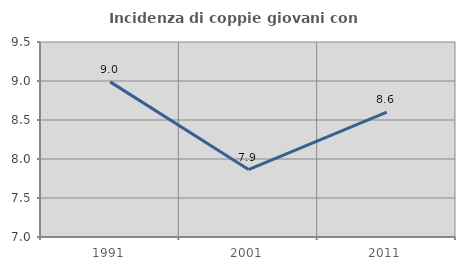
| Category | Incidenza di coppie giovani con figli |
|---|---|
| 1991.0 | 8.989 |
| 2001.0 | 7.865 |
| 2011.0 | 8.602 |